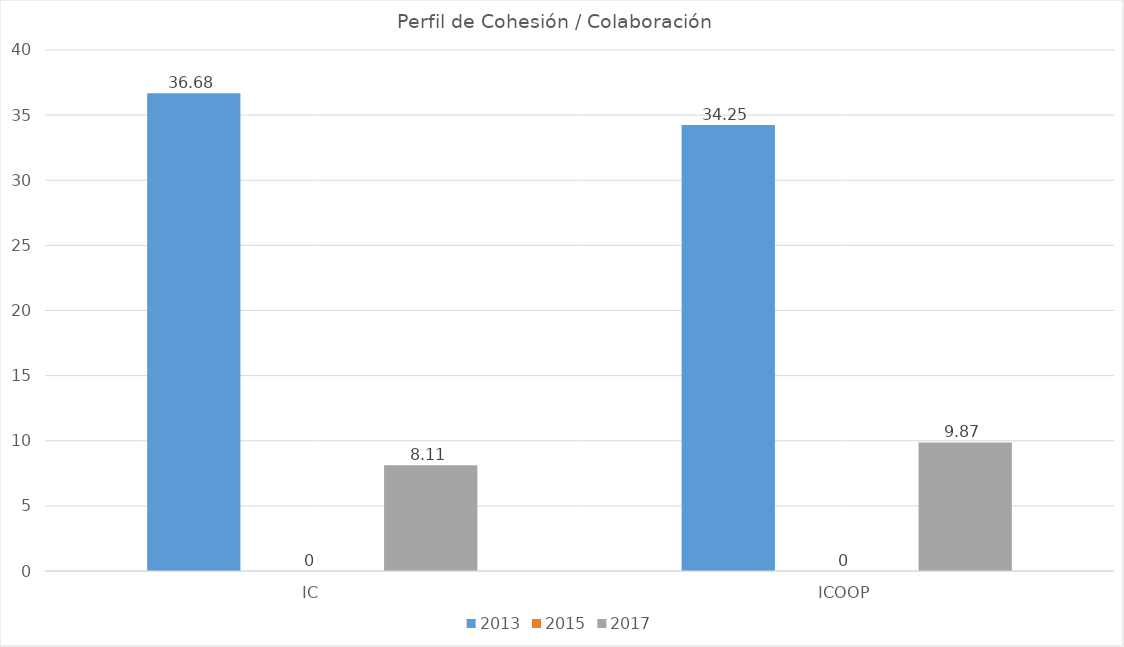
| Category | 2013 | 2015 | 2017 |
|---|---|---|---|
| IC | 36.68 | 0 | 8.11 |
| ICOOP | 34.25 | 0 | 9.87 |